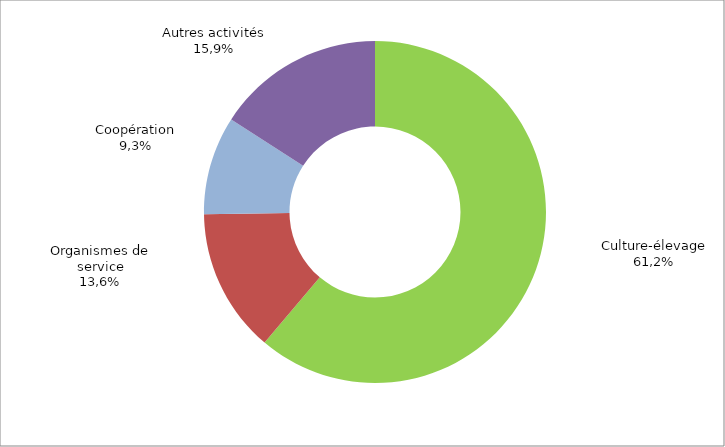
| Category | Series 0 |
|---|---|
| Exploitation Culture-élevage | 1196709 |
| Organismes de service | 266611 |
| Coopération | 181953 |
| Autres activités | 311033 |